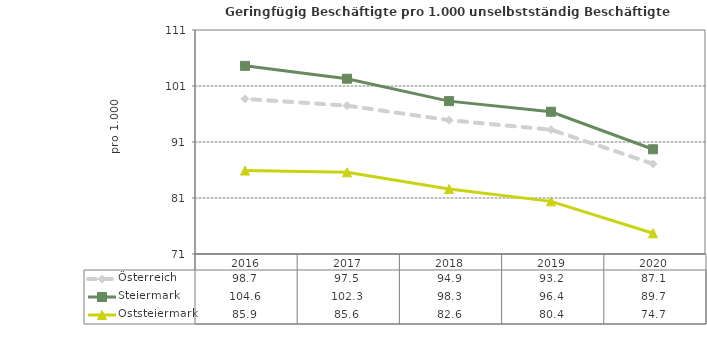
| Category | Österreich | Steiermark | Oststeiermark |
|---|---|---|---|
| 2020.0 | 87.1 | 89.7 | 74.7 |
| 2019.0 | 93.2 | 96.4 | 80.4 |
| 2018.0 | 94.9 | 98.3 | 82.6 |
| 2017.0 | 97.5 | 102.3 | 85.6 |
| 2016.0 | 98.7 | 104.6 | 85.9 |